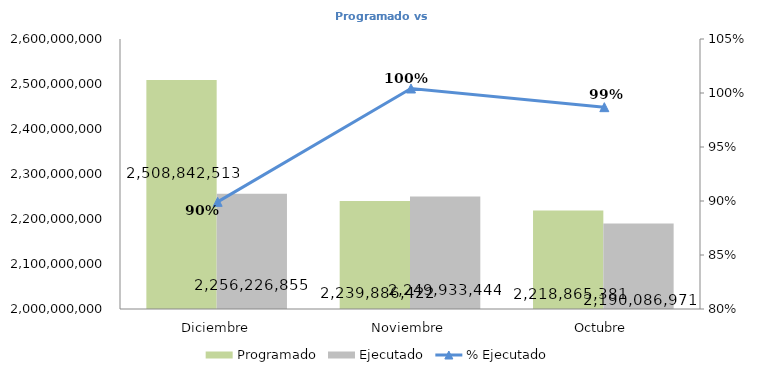
| Category | Programado | Ejecutado |
|---|---|---|
| Diciembre | 2508842513.03 | 2256226854.94 |
| Noviembre | 2239886421.9 | 2249933443.86 |
| Octubre | 2218865381.27 | 2190086970.86 |